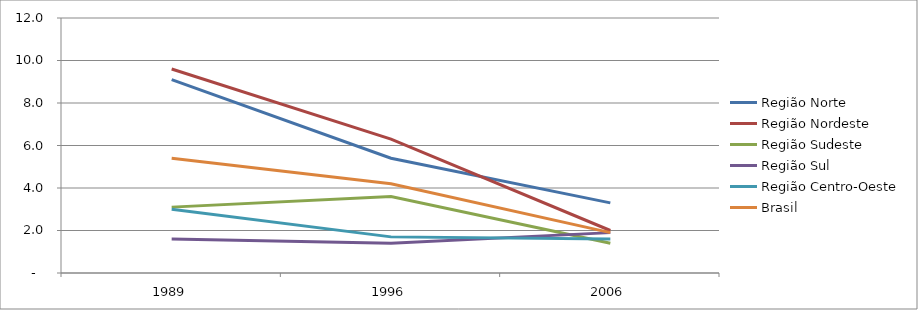
| Category | Região Norte | Região Nordeste | Região Sudeste | Região Sul | Região Centro-Oeste | Brasil |
|---|---|---|---|---|---|---|
| 1989.0 | 9.1 | 9.6 | 3.1 | 1.6 | 3 | 5.4 |
| 1996.0 | 5.4 | 6.3 | 3.6 | 1.4 | 1.7 | 4.2 |
| 2006.0 | 3.3 | 2 | 1.4 | 1.9 | 1.6 | 1.9 |